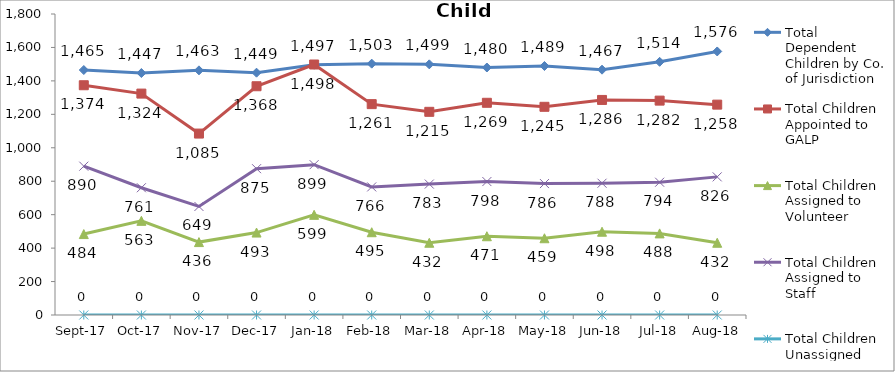
| Category | Total Dependent Children by Co. of Jurisdiction | Total Children Appointed to GALP | Total Children Assigned to Volunteer | Total Children Assigned to Staff | Total Children Unassigned |
|---|---|---|---|---|---|
| 2017-09-01 | 1465 | 1374 | 484 | 890 | 0 |
| 2017-10-01 | 1447 | 1324 | 563 | 761 | 0 |
| 2017-11-01 | 1463 | 1085 | 436 | 649 | 0 |
| 2017-12-01 | 1449 | 1368 | 493 | 875 | 0 |
| 2018-01-01 | 1497 | 1498 | 599 | 899 | 0 |
| 2018-02-01 | 1503 | 1261 | 495 | 766 | 0 |
| 2018-03-01 | 1499 | 1215 | 432 | 783 | 0 |
| 2018-04-01 | 1480 | 1269 | 471 | 798 | 0 |
| 2018-05-01 | 1489 | 1245 | 459 | 786 | 0 |
| 2018-06-01 | 1467 | 1286 | 498 | 788 | 0 |
| 2018-07-01 | 1514 | 1282 | 488 | 794 | 0 |
| 2018-08-01 | 1576 | 1258 | 432 | 826 | 0 |